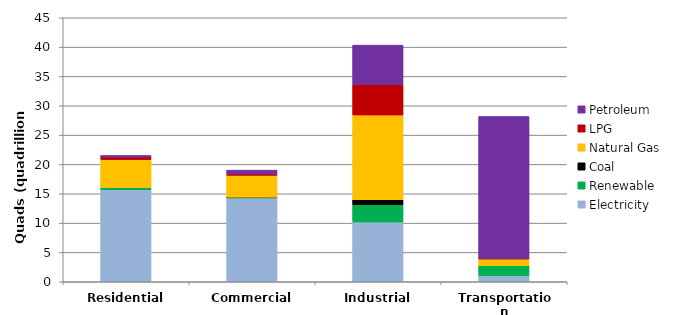
| Category | Electricity | Renewable | Coal | Natural Gas | LPG | Petroleum |
|---|---|---|---|---|---|---|
| Residential | 15.683 | 0.338 | 0 | 4.823 | 0.416 | 0.275 |
| Commercial | 14.279 | 0.131 | 0.013 | 3.729 | 0.219 | 0.66 |
| Industrial | 10.203 | 2.93 | 0.858 | 14.44 | 5.197 | 6.71 |
| Transportation | 1.051 | 1.703 | 0 | 1.163 | 0.012 | 24.252 |